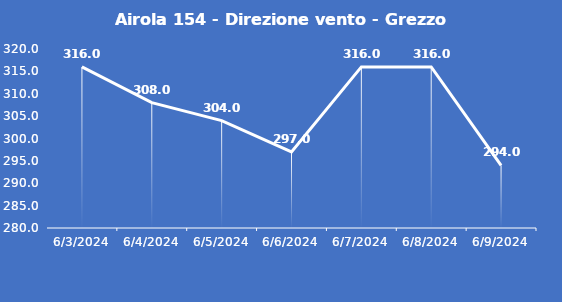
| Category | Airola 154 - Direzione vento - Grezzo (°N) |
|---|---|
| 6/3/24 | 316 |
| 6/4/24 | 308 |
| 6/5/24 | 304 |
| 6/6/24 | 297 |
| 6/7/24 | 316 |
| 6/8/24 | 316 |
| 6/9/24 | 294 |